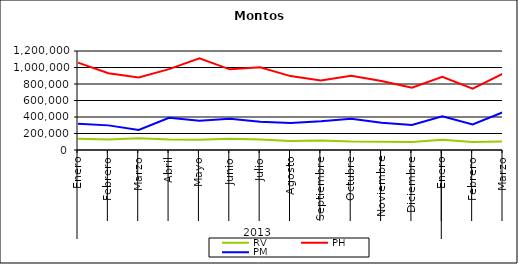
| Category | RV | PH | PM |
|---|---|---|---|
| 0 | 136808.804 | 1058774.967 | 316751.291 |
| 1 | 127193.421 | 930111.334 | 298480.292 |
| 2 | 142052.509 | 880100.908 | 242691.68 |
| 3 | 126637.277 | 980038.371 | 389833.89 |
| 4 | 123189.846 | 1112542.201 | 355777.139 |
| 5 | 135184.022 | 977877.296 | 379782.022 |
| 6 | 127790.361 | 1003315.643 | 342842.568 |
| 7 | 110532.346 | 895717.973 | 326616.455 |
| 8 | 114630.859 | 843607.598 | 348985.725 |
| 9 | 102262.08 | 901170.281 | 379642.157 |
| 10 | 99242.352 | 837424.505 | 330278.777 |
| 11 | 96243.301 | 754952.55 | 304473.582 |
| 12 | 124770.971 | 885857.327 | 408057.686 |
| 13 | 96987.292 | 744736.746 | 309218.036 |
| 14 | 103624.997 | 925209.281 | 458118.752 |